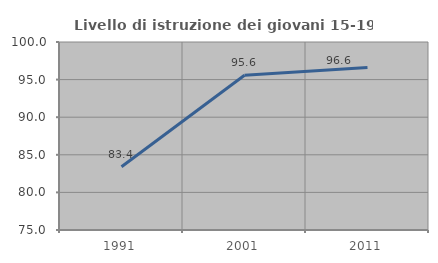
| Category | Livello di istruzione dei giovani 15-19 anni |
|---|---|
| 1991.0 | 83.402 |
| 2001.0 | 95.579 |
| 2011.0 | 96.625 |